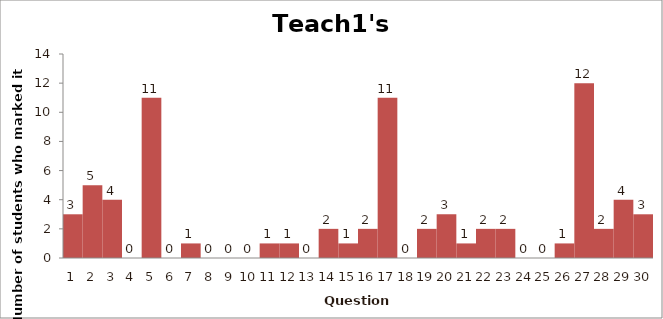
| Category | Series 0 |
|---|---|
| 0 | 3 |
| 1 | 5 |
| 2 | 4 |
| 3 | 0 |
| 4 | 11 |
| 5 | 0 |
| 6 | 1 |
| 7 | 0 |
| 8 | 0 |
| 9 | 0 |
| 10 | 1 |
| 11 | 1 |
| 12 | 0 |
| 13 | 2 |
| 14 | 1 |
| 15 | 2 |
| 16 | 11 |
| 17 | 0 |
| 18 | 2 |
| 19 | 3 |
| 20 | 1 |
| 21 | 2 |
| 22 | 2 |
| 23 | 0 |
| 24 | 0 |
| 25 | 1 |
| 26 | 12 |
| 27 | 2 |
| 28 | 4 |
| 29 | 3 |